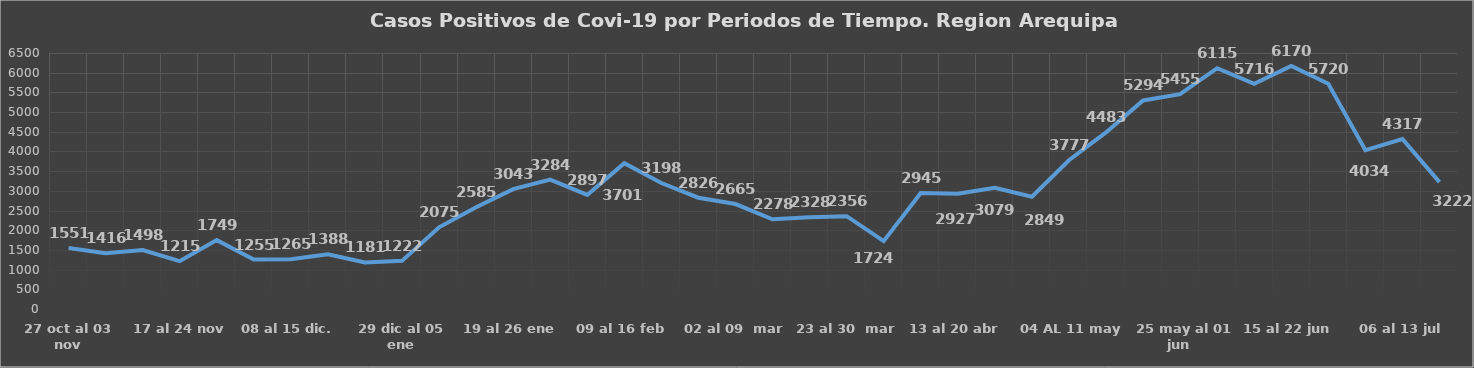
| Category | Region |
|---|---|
| 27 oct al 03 nov | 1551 |
| 03 al 10 nov | 1416 |
| 10 al 17 nov | 1498 |
|  17 al 24 nov | 1215 |
|  24 nov al 01 dic | 1749 |
| 01 al 08 dic. | 1255 |
| 08 al 15 dic. | 1265 |
| 15 al 22 dic | 1388 |
| 22 al 29 dic | 1181 |
| 29 dic al 05 ene | 1222 |
| 05 al 12 ene | 2075 |
| 12 al 19 ene | 2585 |
| 19 al 26 ene | 3043 |
| 26 ene al 02 feb | 3284 |
| 02 al 09 feb | 2897 |
| 09 al 16 feb | 3701 |
| 16 al 23 feb | 3198 |
|  23 feb al 02 mar | 2826 |
|  02 al 09  mar | 2665 |
|  09 al 16  mar | 2278 |
|  16 al 23  mar | 2328 |
|  23 al 30  mar | 2356 |
|   30 mar al 06 abr | 1724 |
| 06 al 13 abr | 2945 |
| 13 al 20 abr | 2927 |
| 20 al 27 abr | 3079 |
| 27 abr al 04 may | 2849 |
|  04 AL 11 may | 3777 |
|  11 AL 18 may | 4483 |
|  18 al 25 may | 5294 |
|   25 may al 01 jun | 5455 |
|   01 jun al 08 jun | 6115 |
| 08 al 15 jun | 5716 |
| 15 al 22 jun | 6170 |
| 22 al 29 jun | 5720 |
| 22 Jun  al 06 jul | 4034 |
|  06 al 13 jul | 4317 |
|  13 al 20 jul | 3222 |